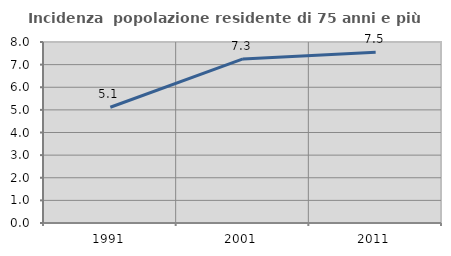
| Category | Incidenza  popolazione residente di 75 anni e più |
|---|---|
| 1991.0 | 5.116 |
| 2001.0 | 7.252 |
| 2011.0 | 7.545 |